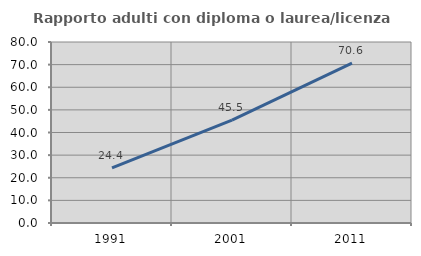
| Category | Rapporto adulti con diploma o laurea/licenza media  |
|---|---|
| 1991.0 | 24.39 |
| 2001.0 | 45.455 |
| 2011.0 | 70.642 |